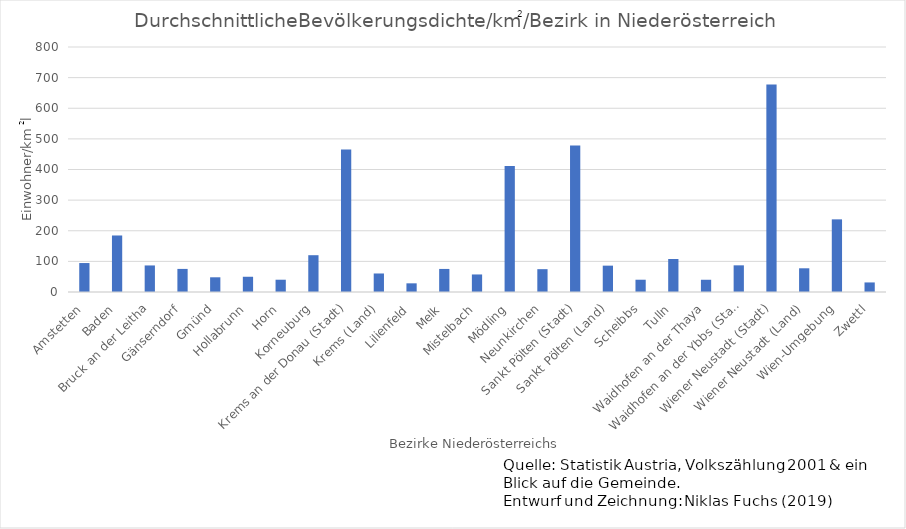
| Category | Durchschnittlicher Einwohner/km2 |
|---|---|
| Amstetten | 94.577 |
| Baden | 184.556 |
| Bruck an der Leitha | 86.696 |
| Gänserndorf | 75.388 |
| Gmünd | 48.027 |
| Hollabrunn | 49.767 |
| Horn | 40.089 |
| Korneuburg | 120.161 |
| Krems an der Donau (Stadt) | 465.646 |
| Krems (Land) | 60.473 |
| Lilienfeld | 28.307 |
| Melk | 75.318 |
| Mistelbach | 57.277 |
| Mödling | 411.833 |
| Neunkirchen | 74.55 |
| Sankt Pölten (Stadt) | 478.716 |
| Sankt Pölten (Land) | 86.057 |
| Scheibbs | 40.079 |
| Tulln | 107.842 |
| Waidhofen an der Thaya | 39.959 |
| Waidhofen an der Ybbs (Stadt) | 87.064 |
| Wiener Neustadt (Stadt) | 677.464 |
| Wiener Neustadt (Land) | 77.408 |
| Wien-Umgebung | 237.203 |
| Zwettl | 31.225 |